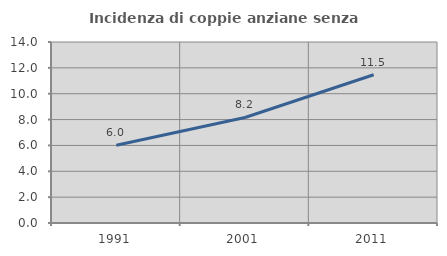
| Category | Incidenza di coppie anziane senza figli  |
|---|---|
| 1991.0 | 6.019 |
| 2001.0 | 8.161 |
| 2011.0 | 11.466 |